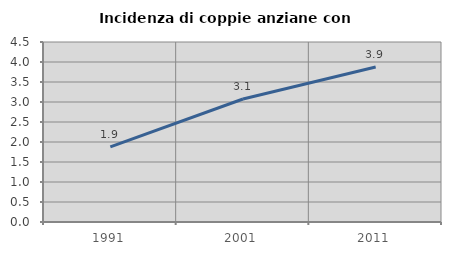
| Category | Incidenza di coppie anziane con figli |
|---|---|
| 1991.0 | 1.877 |
| 2001.0 | 3.076 |
| 2011.0 | 3.875 |